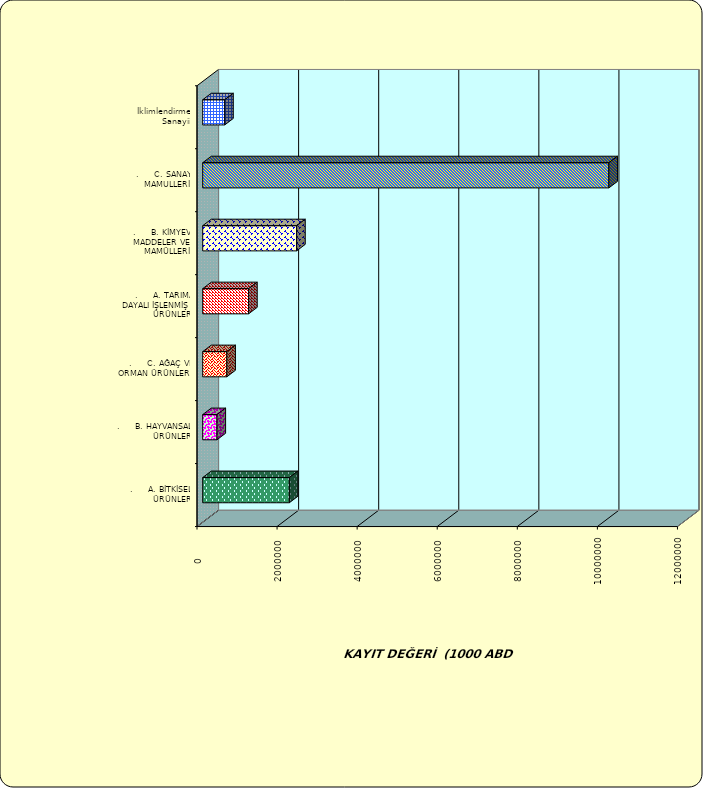
| Category | Series 0 |
|---|---|
| .     A. BİTKİSEL ÜRÜNLER | 2163843.676 |
| .     B. HAYVANSAL ÜRÜNLER | 356889.096 |
| .     C. AĞAÇ VE ORMAN ÜRÜNLERİ | 602945.487 |
| .     A. TARIMA DAYALI İŞLENMİŞ ÜRÜNLER | 1146688.423 |
| .     B. KİMYEVİ MADDELER VE MAMÜLLERİ | 2346327.187 |
| .     C. SANAYİ MAMULLERİ | 10144291.05 |
|  İklimlendirme Sanayii | 549438.718 |